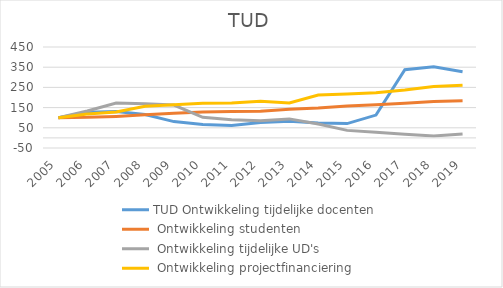
| Category | TUD |
|---|---|
| 2005.0 | 100 |
| 2006.0 | 118.128 |
| 2007.0 | 128.042 |
| 2008.0 | 157.016 |
| 2009.0 | 163.723 |
| 2010.0 | 171.983 |
| 2011.0 | 173.371 |
| 2012.0 | 181.386 |
| 2013.0 | 173.145 |
| 2014.0 | 212.136 |
| 2015.0 | 217.374 |
| 2016.0 | 223.483 |
| 2017.0 | 236.703 |
| 2018.0 | 254.002 |
| 2019.0 | 260.883 |